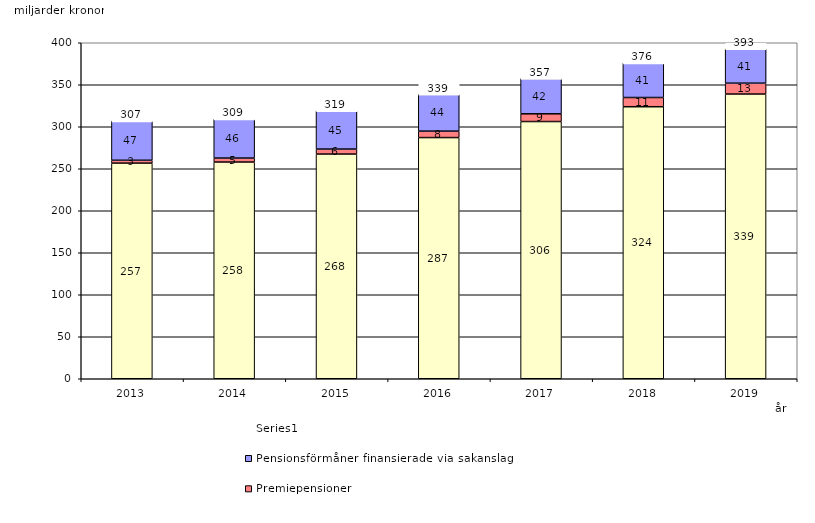
| Category | Inkomstpension och tilläggspension m.m. | Premiepensioner | Pensionsförmåner finansierade via sakanslag | Series 0 |
|---|---|---|---|---|
| 2013.0 | 256.702 | 3.406 | 46.818 | 20 |
| 2014.0 | 257.988 | 4.739 | 46.4 | 20 |
| 2015.0 | 267.502 | 5.967 | 45.453 | 20 |
| 2016.0 | 287.113 | 7.683 | 43.783 | 20 |
| 2017.0 | 306.195 | 9.217 | 42.067 | 20 |
| 2018.0 | 323.836 | 10.983 | 41.157 | 20 |
| 2019.0 | 338.95 | 12.945 | 40.881 | 20 |